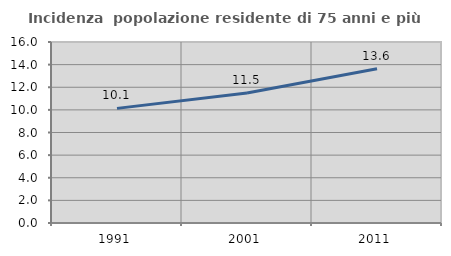
| Category | Incidenza  popolazione residente di 75 anni e più |
|---|---|
| 1991.0 | 10.132 |
| 2001.0 | 11.492 |
| 2011.0 | 13.636 |